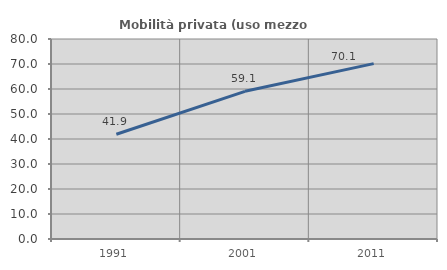
| Category | Mobilità privata (uso mezzo privato) |
|---|---|
| 1991.0 | 41.903 |
| 2001.0 | 59.08 |
| 2011.0 | 70.143 |